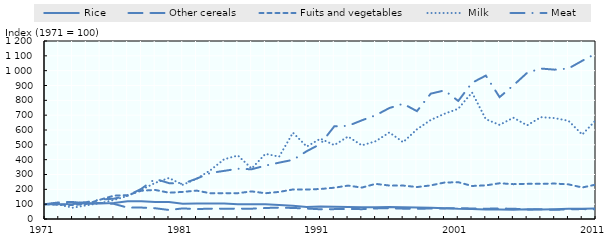
| Category | Rice | Other cereals | Fuits and vegetables | Milk | Meat |
|---|---|---|---|---|---|
| 1971.0 | 100 | 100 | 100 | 100 | 100 |
| 1972.0 | 98.901 | 111.901 | 96.299 | 97.215 | 104.754 |
| 1973.0 | 100.982 | 115.155 | 94.174 | 76.203 | 107.64 |
| 1974.0 | 105.777 | 102.218 | 101.353 | 91.899 | 113.413 |
| 1975.0 | 104.021 | 108.746 | 130.179 | 106.835 | 131.239 |
| 1976.0 | 107.484 | 101.972 | 157.294 | 128.101 | 137.012 |
| 1977.0 | 119.004 | 76.661 | 161.074 | 155.949 | 156.876 |
| 1978.0 | 119.762 | 77.007 | 190.617 | 196.962 | 204.075 |
| 1979.0 | 113.785 | 72.53 | 196.053 | 243.544 | 270.289 |
| 1980.0 | 114.526 | 60.826 | 177.278 | 276.456 | 241.766 |
| 1981.0 | 102.897 | 71.357 | 182.634 | 230.886 | 237.521 |
| 1982.0 | 103.904 | 66.782 | 191.492 | 270.38 | 271.817 |
| 1983.0 | 105.086 | 69.809 | 173.649 | 328.354 | 310.526 |
| 1984.0 | 104.195 | 69.602 | 174.302 | 402.532 | 324.278 |
| 1985.0 | 99.659 | 70.016 | 174.158 | 428.101 | 338.879 |
| 1986.0 | 99.8 | 69.464 | 186.112 | 340.253 | 335.314 |
| 1987.0 | 98.626 | 74.334 | 173.673 | 438.987 | 359.762 |
| 1988.0 | 94.406 | 76.405 | 182.706 | 420.506 | 379.966 |
| 1989.0 | 89.27 | 74.542 | 199.117 | 582.025 | 398.642 |
| 1990.0 | 80.912 | 70.44 | 198.949 | 488.354 | 457.046 |
| 1991.0 | 83.959 | 65.608 | 202.268 | 541.519 | 506.112 |
| 1992.0 | 82.078 | 66.594 | 210.919 | 498.228 | 624.618 |
| 1993.0 | 81.487 | 67.916 | 225.157 | 555.696 | 628.014 |
| 1994.0 | 79.897 | 66.318 | 211.842 | 496.456 | 665.195 |
| 1995.0 | 79.988 | 71.367 | 236.785 | 524.051 | 698.981 |
| 1996.0 | 81.17 | 72.796 | 225.674 | 583.544 | 748.048 |
| 1997.0 | 79.497 | 69.75 | 225.46 | 517.722 | 776.74 |
| 1998.0 | 77.1 | 69.109 | 215.288 | 604.557 | 727.165 |
| 1999.0 | 75.568 | 70.42 | 226.534 | 667.595 | 844.822 |
| 2000.0 | 73.204 | 71.386 | 245.738 | 709.367 | 866.893 |
| 2001.0 | 69.525 | 73.881 | 248.126 | 743.038 | 795.925 |
| 2002.0 | 68.076 | 70.854 | 222.618 | 853.165 | 918.166 |
| 2003.0 | 63.531 | 69.671 | 226.661 | 672.911 | 966.723 |
| 2004.0 | 64.147 | 70.528 | 240.891 | 634.684 | 821.562 |
| 2005.0 | 63.065 | 69.395 | 234.994 | 682.785 | 900.679 |
| 2006.0 | 65.862 | 64.317 | 237.111 | 631.392 | 985.569 |
| 2007.0 | 63.723 | 65.589 | 237.143 | 686.329 | 1014.261 |
| 2008.0 | 65.204 | 61.704 | 238.814 | 680.253 | 1006.791 |
| 2009.0 | 68.384 | 65.342 | 233.522 | 662.025 | 1014.601 |
| 2010.0 | 69.425 | 66.93 | 212.479 | 569.114 | 1066.553 |
| 2011.0 | 71.223 | 65.017 | 232.121 | 667.342 | 1116.469 |